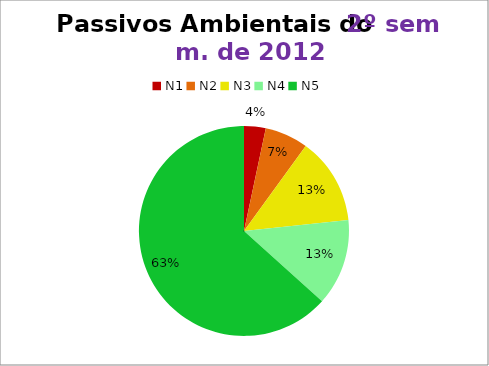
| Category | 2º/12 |
|---|---|
| N1 | 1 |
| N2 | 2 |
| N3 | 4 |
| N4 | 4 |
| N5 | 19 |